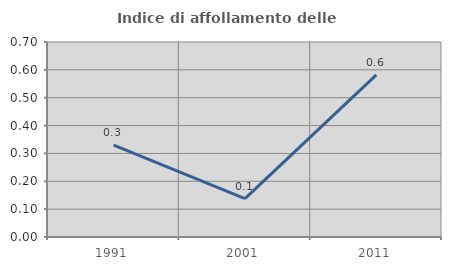
| Category | Indice di affollamento delle abitazioni  |
|---|---|
| 1991.0 | 0.33 |
| 2001.0 | 0.138 |
| 2011.0 | 0.582 |